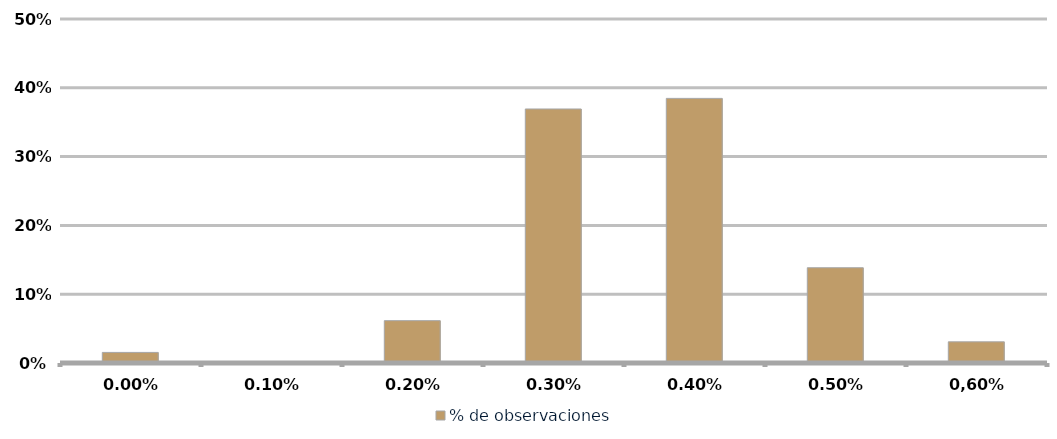
| Category | % de observaciones  |
|---|---|
| 0,00% | 0.015 |
| 0,10% | 0 |
| 0,20% | 0.062 |
| 0,30% | 0.369 |
| 0,40% | 0.385 |
| 0,50% | 0.138 |
| 0,60% | 0.031 |